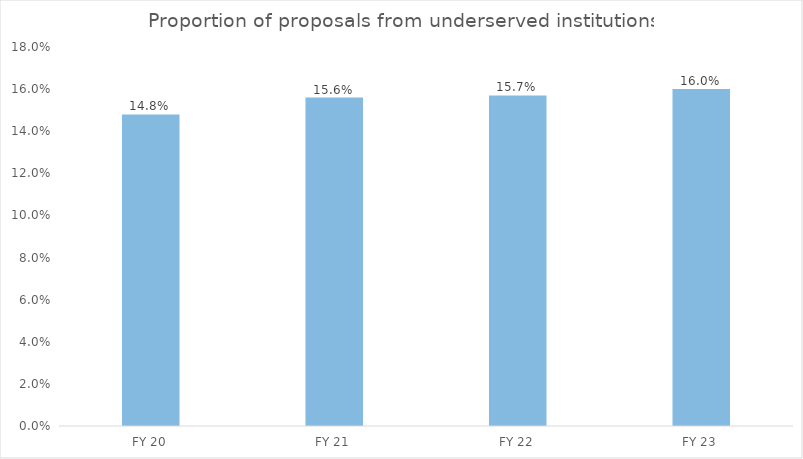
| Category | Series 1 |
|---|---|
| FY 20 | 0.148 |
| FY 21 | 0.156 |
| FY 22 | 0.157 |
| FY 23 | 0.16 |